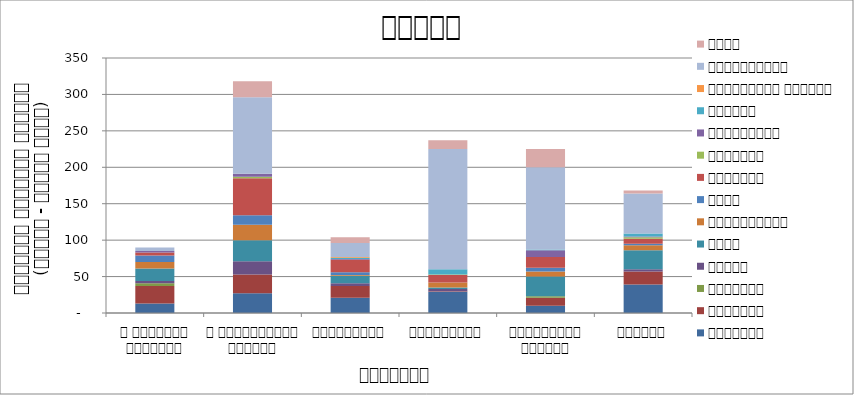
| Category | सुरक्षा | राजनीति | आन्दोलन | न्याय | शासन | अर्थतन्त्र | समाज | कुटनीति | वातावरण | स्वास्थ्य  | शिक्षा | प्राकृतिक प्रकोप | भ्रष्टाचार | अन्य |
|---|---|---|---|---|---|---|---|---|---|---|---|---|---|---|
| द हिमालयन टाइम्स् | 13 | 24 | 4 | 3 | 17 | 9 | 9 | 4 | 0 | 2 | 0 | 0 | 5 | 0 |
| द काठमाण्डौं पोस्ट् | 27 | 26 | 0 | 18 | 29 | 21 | 13 | 51 | 2 | 4 | 0 | 0 | 105 | 22 |
| रिपब्लिका | 21 | 16 | 0 | 4 | 10 | 1 | 4 | 17 | 0 | 1 | 2 | 1 | 19 | 8 |
| कान्तिपुर | 29 | 1 | 0 | 3 | 2 | 7 | 0 | 10 | 1 | 0 | 7 | 0 | 165 | 12 |
| अन्नपूर्ण पोस्ट् | 10 | 11 | 2 | 0 | 27 | 7 | 5 | 15 | 0 | 9 | 1 | 0 | 113 | 25 |
| नागरिक | 39 | 18 | 0 | 3 | 26 | 7 | 2 | 7 | 2 | 1 | 4 | 0 | 55 | 4 |